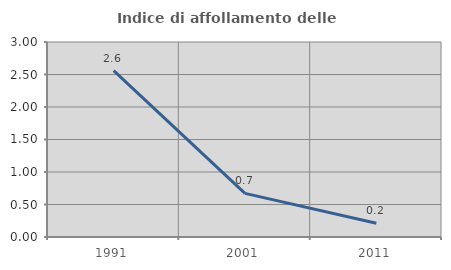
| Category | Indice di affollamento delle abitazioni  |
|---|---|
| 1991.0 | 2.558 |
| 2001.0 | 0.671 |
| 2011.0 | 0.213 |